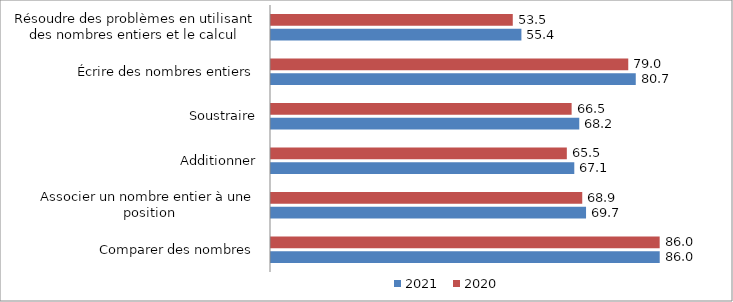
| Category | 2021 | 2020 |
|---|---|---|
| Comparer des nombres | 86 | 85.99 |
| Associer un nombre entier à une position | 69.7 | 68.86 |
| Additionner | 67.1 | 65.45 |
| Soustraire | 68.2 | 66.51 |
| Écrire des nombres entiers | 80.7 | 79.04 |
| Résoudre des problèmes en utilisant des nombres entiers et le calcul | 55.4 | 53.49 |